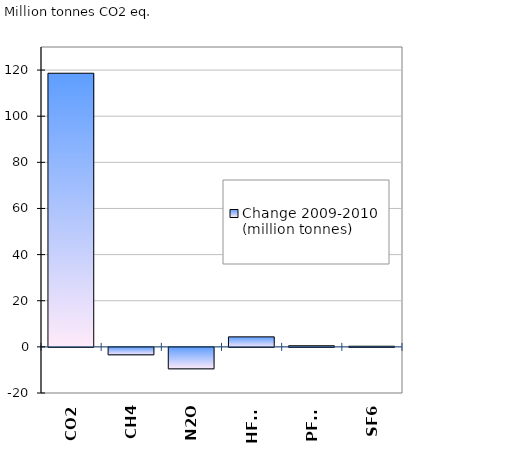
| Category | Change 2009-2010 (million tonnes) |
|---|---|
| CO2 | 118.62 |
| CH4 | -3.227 |
| N2O | -9.31 |
| HFCs | 4.351 |
| PFCs | 0.486 |
| SF6 | 0.273 |